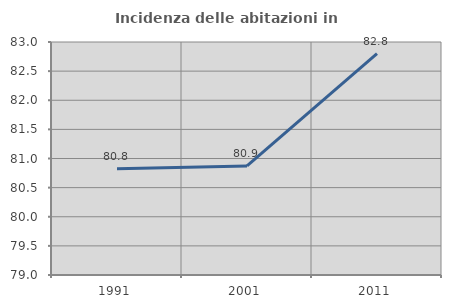
| Category | Incidenza delle abitazioni in proprietà  |
|---|---|
| 1991.0 | 80.822 |
| 2001.0 | 80.872 |
| 2011.0 | 82.801 |